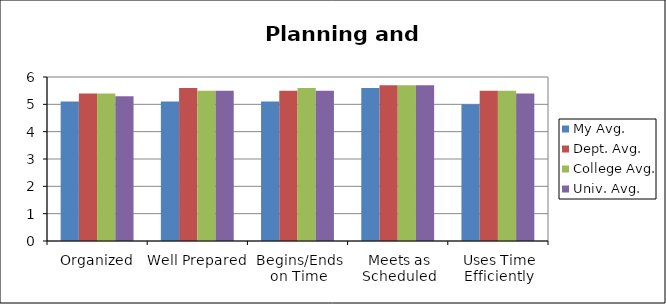
| Category | My Avg. | Dept. Avg. | College Avg. | Univ. Avg. |
|---|---|---|---|---|
| Organized | 5.1 | 5.4 | 5.4 | 5.3 |
| Well Prepared | 5.1 | 5.6 | 5.5 | 5.5 |
| Begins/Ends on Time | 5.1 | 5.5 | 5.6 | 5.5 |
| Meets as Scheduled | 5.6 | 5.7 | 5.7 | 5.7 |
| Uses Time Efficiently | 5 | 5.5 | 5.5 | 5.4 |